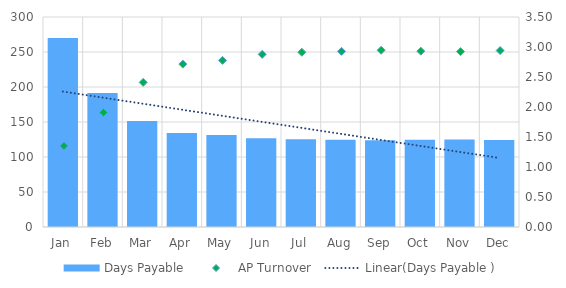
| Category | Days Payable |
|---|---|
| Jan | 270.1 |
| Feb | 191.321 |
| Mar | 151.398 |
| Apr | 134.426 |
| May | 131.425 |
| Jun | 126.863 |
| Jul | 125.327 |
| Aug | 124.668 |
| Sep | 123.893 |
| Oct | 124.549 |
| Nov | 124.861 |
| Dec | 124.118 |